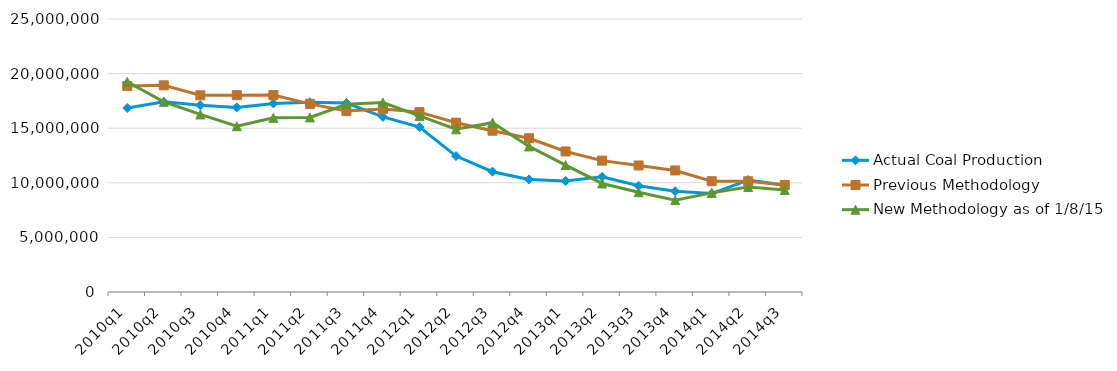
| Category | Actual Coal Production | Previous Methodology | New Methodology as of 1/8/15 |
|---|---|---|---|
| 2010q1 | 16849919 | 18871807 | 19250053 |
| 2010q2 | 17413237 | 18923501 | 17421173 |
| 2010q3 | 17104557 | 18011829 | 16260614 |
| 2010q4 | 16904889 | 18024457 | 15178075 |
| 2011q1 | 17269209 | 18038165 | 15947415 |
| 2011q2 | 17378190 | 17229295 | 15987736 |
| 2011q3 | 17301995 | 16582838 | 17189447 |
| 2011q4 | 16035605 | 16768547 | 17352043 |
| 2012q1 | 15105381 | 16473408 | 16123140 |
| 2012q2 | 12447949 | 15505378 | 14902015 |
| 2012q3 | 11016887 | 14769464 | 15507816 |
| 2012q4 | 10308701 | 14077833 | 13330246 |
| 2013q1 | 10169242 | 12871582 | 11624827 |
| 2013q2 | 10544760 | 12030137 | 9939705 |
| 2013q3 | 9725088 | 11587076 | 9141383 |
| 2013q4 | 9227873 | 11129601 | 8411315 |
| 2014q1 | 9016444 | 10147876 | 9075746 |
| 2014q2 | 10255816 | 10139686 | 9611140 |
| 2014q3 | 9780757 | 9805406 | 9342196 |